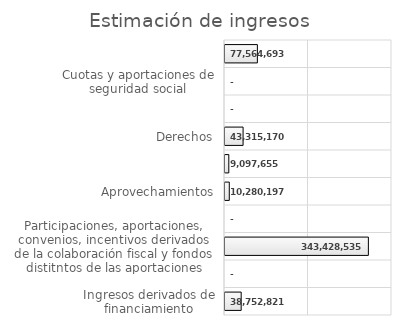
| Category | Series 0 |
|---|---|
| Ingresos derivados de financiamiento | 38752821 |
| Transferencias, asignaciones, subsidios y subvenciones y pensiones y jubilaciones | 0 |
| Participaciones, aportaciones, convenios, incentivos derivados de la colaboración fiscal y fondos distitntos de las aportaciones | 343428535 |
| Ingresos por venta de bienes, prestación de servicios y otros ingresos | 0 |
| Aprovechamientos | 10280197 |
| Productos | 9097655 |
| Derechos | 43315170 |
| Contribuciones de mejoras | 0 |
| Cuotas y aportaciones de seguridad social | 0 |
| Impuestos | 77564693 |